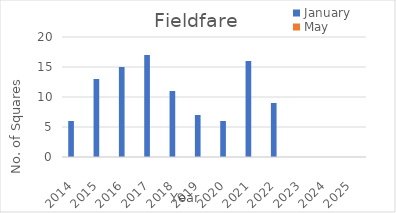
| Category | January | May |
|---|---|---|
| 2014.0 | 6 | 0 |
| 2015.0 | 13 | 0 |
| 2016.0 | 15 | 0 |
| 2017.0 | 17 | 0 |
| 2018.0 | 11 | 0 |
| 2019.0 | 7 | 0 |
| 2020.0 | 6 | 0 |
| 2021.0 | 16 | 0 |
| 2022.0 | 9 | 0 |
| 2023.0 | 0 | 0 |
| 2024.0 | 0 | 0 |
| 2025.0 | 0 | 0 |